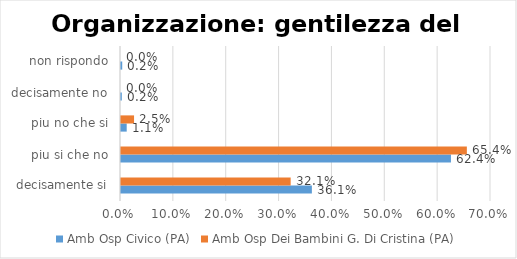
| Category | Amb Osp Civico (PA) | Amb Osp Dei Bambini G. Di Cristina (PA) |
|---|---|---|
| decisamente si | 0.361 | 0.321 |
| piu si che no | 0.624 | 0.654 |
| piu no che si | 0.011 | 0.025 |
| decisamente no | 0.002 | 0 |
| non rispondo | 0.002 | 0 |